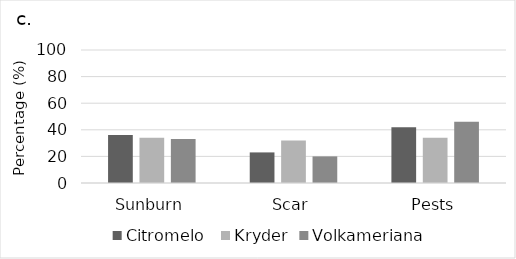
| Category | Citromelo  | Kryder | Volkameriana |
|---|---|---|---|
| Sunburn | 36 | 34 | 33 |
| Scar | 23 | 32 | 20 |
| Pests | 42 | 34 | 46 |